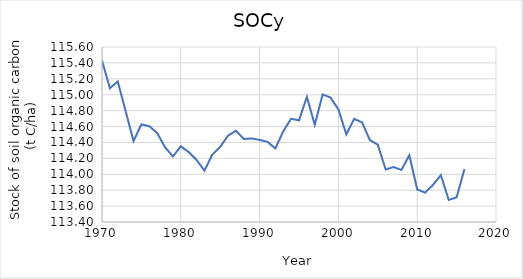
| Category | Series 0 |
|---|---|
| 1970.0 | 115.43 |
| 1971.0 | 115.082 |
| 1972.0 | 115.166 |
| 1973.0 | 114.793 |
| 1974.0 | 114.418 |
| 1975.0 | 114.627 |
| 1976.0 | 114.604 |
| 1977.0 | 114.519 |
| 1978.0 | 114.34 |
| 1979.0 | 114.224 |
| 1980.0 | 114.352 |
| 1981.0 | 114.279 |
| 1982.0 | 114.18 |
| 1983.0 | 114.046 |
| 1984.0 | 114.247 |
| 1985.0 | 114.345 |
| 1986.0 | 114.486 |
| 1987.0 | 114.547 |
| 1988.0 | 114.444 |
| 1989.0 | 114.45 |
| 1990.0 | 114.432 |
| 1991.0 | 114.407 |
| 1992.0 | 114.325 |
| 1993.0 | 114.54 |
| 1994.0 | 114.698 |
| 1995.0 | 114.678 |
| 1996.0 | 114.974 |
| 1997.0 | 114.622 |
| 1998.0 | 115.004 |
| 1999.0 | 114.965 |
| 2000.0 | 114.815 |
| 2001.0 | 114.501 |
| 2002.0 | 114.697 |
| 2003.0 | 114.652 |
| 2004.0 | 114.429 |
| 2005.0 | 114.372 |
| 2006.0 | 114.06 |
| 2007.0 | 114.091 |
| 2008.0 | 114.054 |
| 2009.0 | 114.239 |
| 2010.0 | 113.81 |
| 2011.0 | 113.769 |
| 2012.0 | 113.866 |
| 2013.0 | 113.989 |
| 2014.0 | 113.677 |
| 2015.0 | 113.71 |
| 2016.0 | 114.065 |